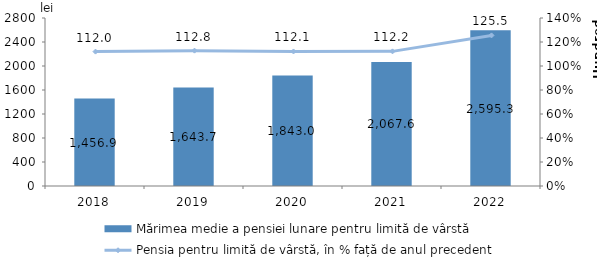
| Category | Mărimea medie a pensiei lunare pentru limită de vârstă |
|---|---|
| 2018.0 | 1456.9 |
| 2019.0 | 1643.7 |
| 2020.0 | 1843 |
| 2021.0 | 2067.6 |
| 2022.0 | 2595.3 |